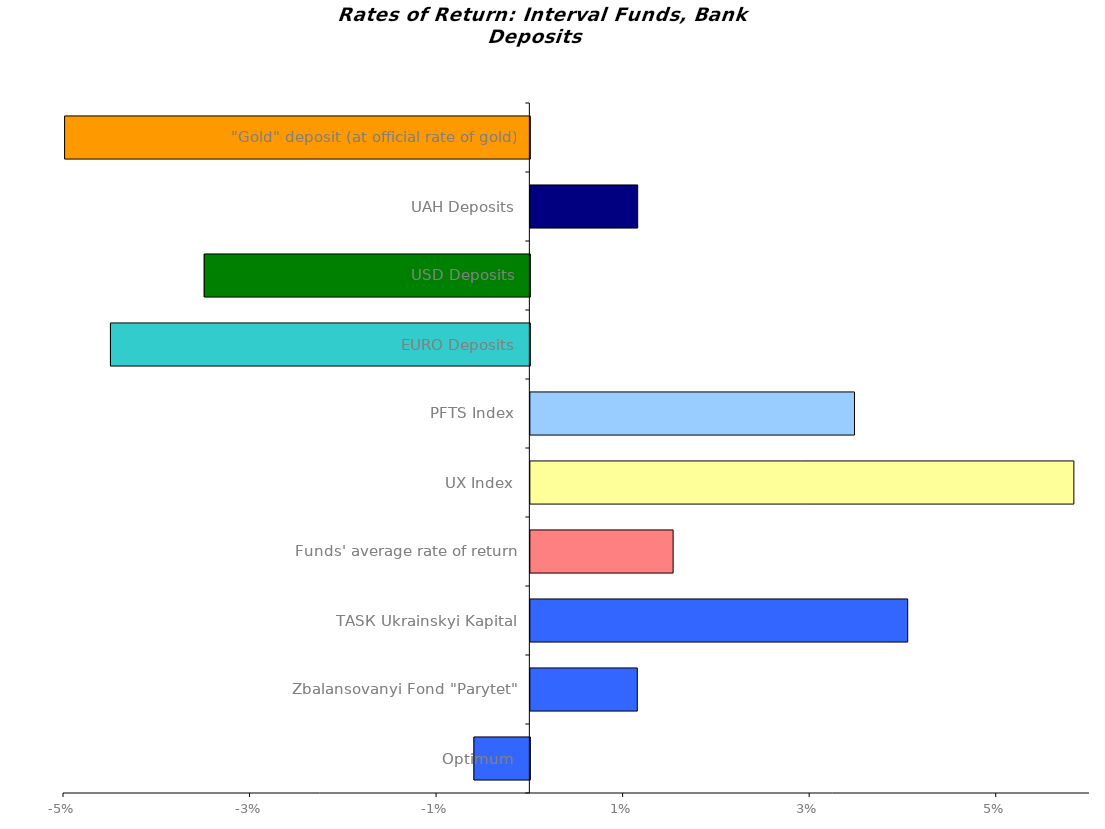
| Category | Series 0 |
|---|---|
| Optimum | -0.006 |
| Zbalansovanyi Fond "Parytet" | 0.011 |
| ТАSК Ukrainskyi Kapital | 0.04 |
| Funds' average rate of return | 0.015 |
| UX Index | 0.058 |
| PFTS Index | 0.035 |
| EURO Deposits | -0.045 |
| USD Deposits | -0.035 |
| UAH Deposits | 0.012 |
| "Gold" deposit (at official rate of gold) | -0.05 |